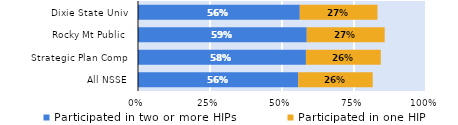
| Category | Participated in two or more HIPs | Participated in one HIP |
|---|---|---|
| All NSSE | 0.556 | 0.259 |
| Strategic Plan Comp | 0.583 | 0.26 |
| Rocky Mt Public | 0.586 | 0.271 |
| Dixie State Univ | 0.562 | 0.27 |